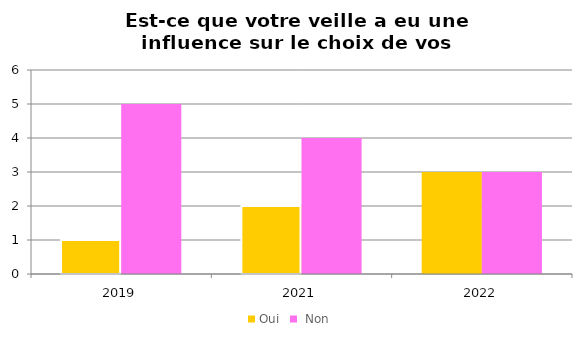
| Category | Oui |  Non |
|---|---|---|
| 2019.0 | 1 | 5 |
| 2021.0 | 2 | 4 |
| 2022.0 | 3 | 3 |